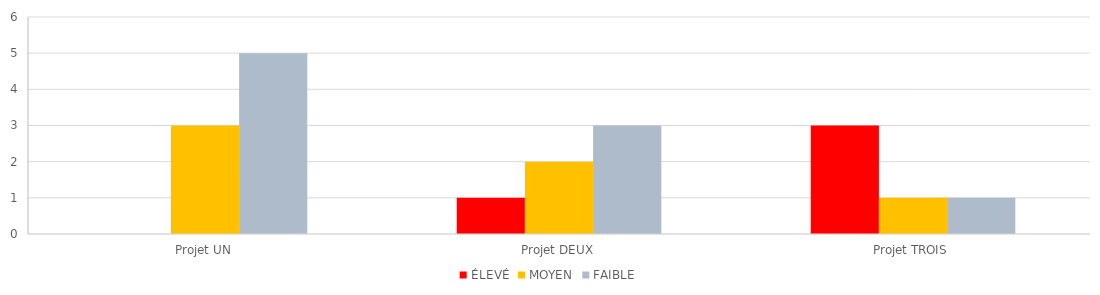
| Category | ÉLEVÉ | MOYEN | FAIBLE |
|---|---|---|---|
| Projet UN | 0 | 3 | 5 |
| Projet DEUX | 1 | 2 | 3 |
| Projet TROIS | 3 | 1 | 1 |